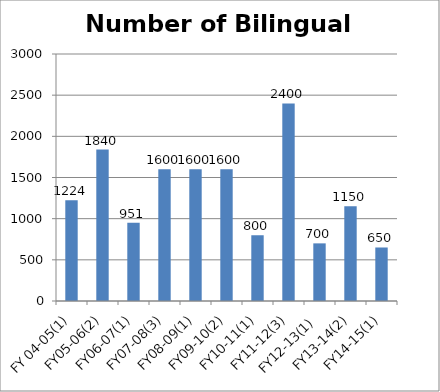
| Category | Number of Bilingual Pollworkers |
|---|---|
| FY 04-05(1) | 1224 |
| FY05-06(2) | 1840 |
| FY06-07(1) | 951 |
| FY07-08(3) | 1600 |
| FY08-09(1) | 1600 |
| FY09-10(2) | 1600 |
| FY10-11(1) | 800 |
| FY11-12(3) | 2400 |
| FY12-13(1)  | 700 |
| FY13-14(2) | 1150 |
| FY14-15(1) | 650 |